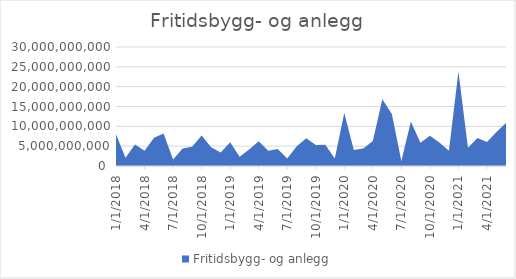
| Category | Fritidsbygg- og anlegg |
|---|---|
| 1/1/18 | 7973010000 |
| 2/1/18 | 2106650000 |
| 3/1/18 | 5441650000 |
| 4/1/18 | 3859520000 |
| 5/1/18 | 7131200000 |
| 6/1/18 | 8197300000 |
| 7/1/18 | 1611269000 |
| 8/1/18 | 4411575000 |
| 9/1/18 | 4861630000 |
| 10/1/18 | 7714580000 |
| 11/1/18 | 4723950000 |
| 12/1/18 | 3383330000 |
| 1/1/19 | 5989150000 |
| 2/1/19 | 2325150000 |
| 3/1/19 | 4171250000 |
| 4/1/19 | 6252320000 |
| 5/1/19 | 3854850000 |
| 6/1/19 | 4300080000 |
| 7/1/19 | 1904000000 |
| 8/1/19 | 4962800000 |
| 9/1/19 | 6999600000 |
| 10/1/19 | 5296900000 |
| 11/1/19 | 5345200000 |
| 12/1/19 | 1903900000 |
| 1/1/20 | 13361530000 |
| 2/1/20 | 4012050000 |
| 3/1/20 | 4439820000 |
| 4/1/20 | 6283750000 |
| 5/1/20 | 16799350000 |
| 6/1/20 | 13103550000 |
| 7/1/20 | 1251960000 |
| 8/1/20 | 11187500000 |
| 9/1/20 | 5848360000 |
| 10/1/20 | 7621350000 |
| 11/1/20 | 5955460000 |
| 12/1/20 | 3848920000 |
| 1/1/21 | 23819250000 |
| 2/1/21 | 4608950000 |
| 3/1/21 | 7067800000 |
| 4/1/21 | 6046330000 |
| 5/1/21 | 8553650000 |
| 6/1/21 | 10862315000 |